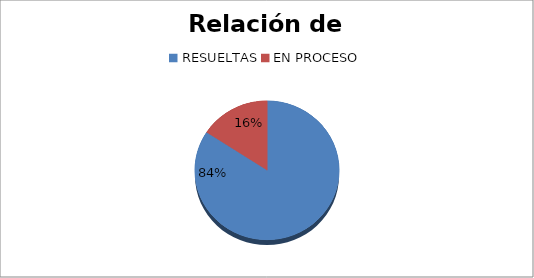
| Category | Series 0 |
|---|---|
| RESUELTAS | 16 |
| EN PROCESO | 3 |